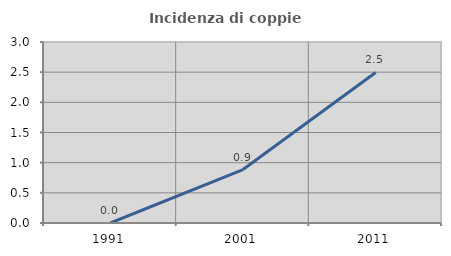
| Category | Incidenza di coppie miste |
|---|---|
| 1991.0 | 0 |
| 2001.0 | 0.886 |
| 2011.0 | 2.495 |